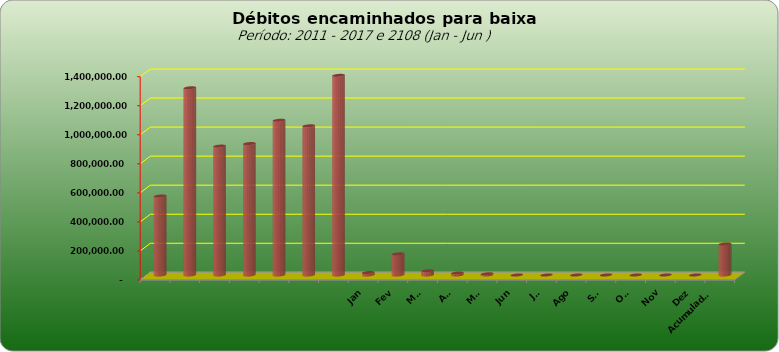
| Category |  543.796,20  |
|---|---|
|  | 543796.2 |
|  | 1289053.69 |
|  | 887573.08 |
|  | 905052.31 |
|  | 1065434.28 |
|  | 1027209.41 |
|  | 1374800.36 |
| Jan | 17005.62 |
| Fev | 145413 |
| Mar | 28943.58 |
| Abr | 13957.8 |
| Mai | 8316.5 |
| Jun | 0 |
| Jul | 0 |
| Ago | 0 |
| Set | 0 |
| Out | 0 |
| Nov | 0 |
| Dez | 0 |
| Acumulado
2016 | 213636.5 |